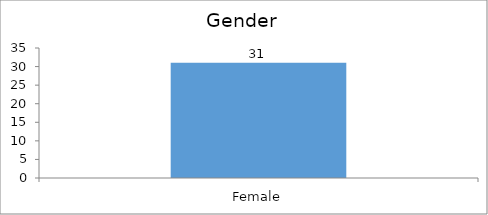
| Category | Gender |
|---|---|
| Female | 31 |